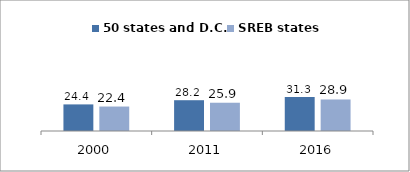
| Category | 50 states and D.C. | SREB states |
|---|---|---|
| 2000.0 | 24.402 | 22.445 |
| 2011.0 | 28.246 | 25.933 |
| 2016.0 | 31.278 | 28.913 |